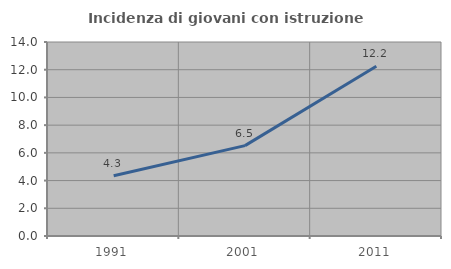
| Category | Incidenza di giovani con istruzione universitaria |
|---|---|
| 1991.0 | 4.348 |
| 2001.0 | 6.522 |
| 2011.0 | 12.245 |